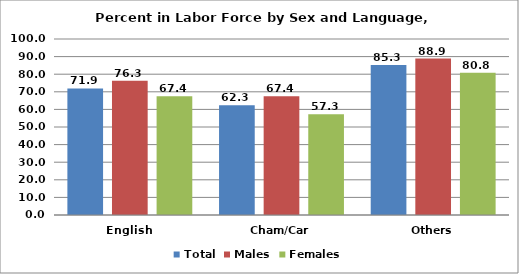
| Category | Total | Males | Females |
|---|---|---|---|
| English | 71.88 | 76.334 | 67.444 |
| Cham/Car | 62.313 | 67.435 | 57.273 |
| Others | 85.256 | 88.863 | 80.76 |